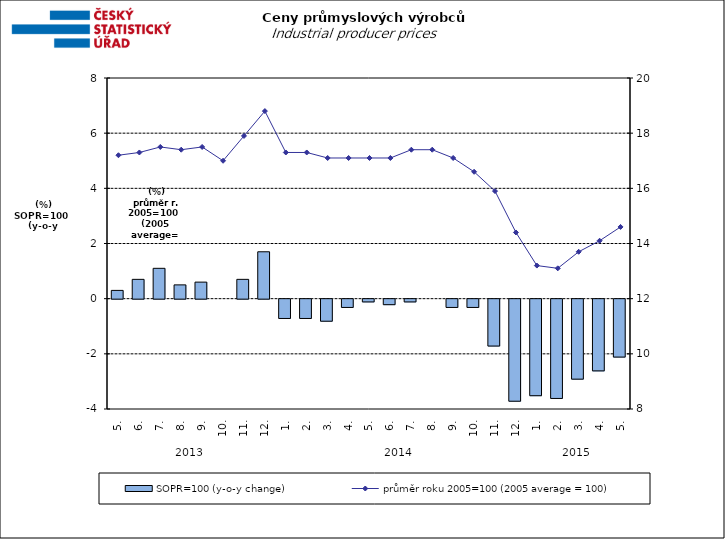
| Category | SOPR=100 (y-o-y change)   |
|---|---|
| 0 | 0.3 |
| 1 | 0.7 |
| 2 | 1.1 |
| 3 | 0.5 |
| 4 | 0.6 |
| 5 | 0 |
| 6 | 0.7 |
| 7 | 1.7 |
| 8 | -0.7 |
| 9 | -0.7 |
| 10 | -0.8 |
| 11 | -0.3 |
| 12 | -0.1 |
| 13 | -0.2 |
| 14 | -0.1 |
| 15 | 0 |
| 16 | -0.3 |
| 17 | -0.3 |
| 18 | -1.7 |
| 19 | -3.7 |
| 20 | -3.5 |
| 21 | -3.6 |
| 22 | -2.9 |
| 23 | -2.6 |
| 24 | -2.1 |